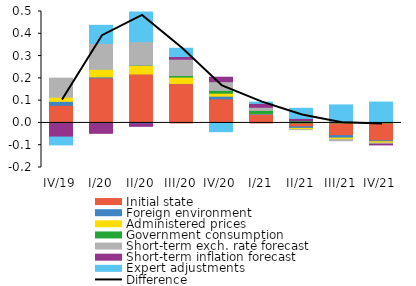
| Category | Initial state | Foreign environment | Administered prices | Government consumption | Short-term exch. rate forecast  | Short-term inflation forecast  | Expert adjustments |
|---|---|---|---|---|---|---|---|
| IV/19 | 0.079 | 0.018 | 0.019 | -0.003 | 0.085 | -0.061 | -0.035 |
| I/20 | 0.202 | 0.004 | 0.034 | -0.003 | 0.116 | -0.044 | 0.082 |
| II/20 | 0.22 | -0.004 | 0.039 | 0.001 | 0.105 | -0.011 | 0.133 |
| III/20 | 0.176 | 0.001 | 0.029 | 0.007 | 0.073 | 0.012 | 0.037 |
| IV/20 | 0.108 | 0.012 | 0.013 | 0.012 | 0.039 | 0.02 | -0.039 |
| I/21 | 0.039 | 0.003 | 0.001 | 0.013 | 0.014 | 0.018 | 0.006 |
| II/21 | -0.018 | -0.007 | -0.005 | 0.01 | 0 | 0.011 | 0.045 |
| III/21 | -0.057 | -0.011 | -0.007 | 0.005 | -0.005 | 0.003 | 0.073 |
| IV/21 | -0.08 | -0.004 | -0.006 | 0.003 | -0.005 | -0.003 | 0.09 |